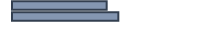
| Category | 47.1 |
|---|---|
| 0 | 47.1 |
| 1 | 52.9 |